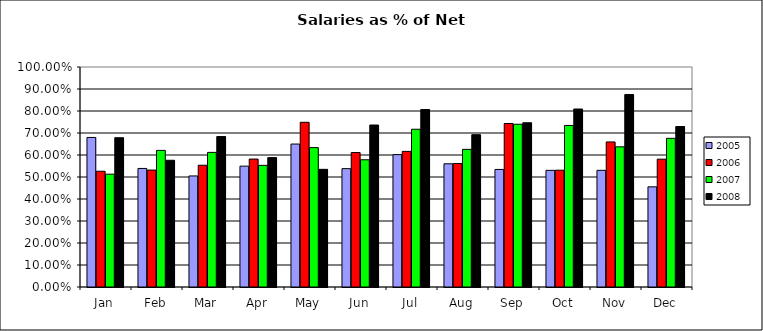
| Category | 2001 | 2004 | 2005 | 2006 | 2007 | 2008 |
|---|---|---|---|---|---|---|
| Jan |  |  | 0.68 | 0.526 | 0.513 | 0.679 |
| Feb |  |  | 0.539 | 0.532 | 0.621 | 0.576 |
| Mar |  |  | 0.505 | 0.553 | 0.612 | 0.684 |
| Apr |  |  | 0.549 | 0.582 | 0.553 | 0.588 |
| May |  |  | 0.65 | 0.749 | 0.634 | 0.535 |
| Jun |  |  | 0.538 | 0.611 | 0.578 | 0.736 |
| Jul |  |  | 0.602 | 0.616 | 0.717 | 0.807 |
| Aug |  |  | 0.56 | 0.561 | 0.626 | 0.692 |
| Sep |  |  | 0.534 | 0.743 | 0.74 | 0.747 |
| Oct |  |  | 0.53 | 0.531 | 0.734 | 0.809 |
| Nov |  |  | 0.53 | 0.659 | 0.637 | 0.875 |
| Dec |  |  | 0.455 | 0.581 | 0.676 | 0.729 |